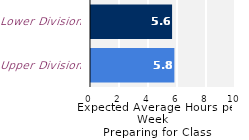
| Category | Series 0 |
|---|---|
| Upper Division | 5.75 |
| Lower Division | 5.592 |